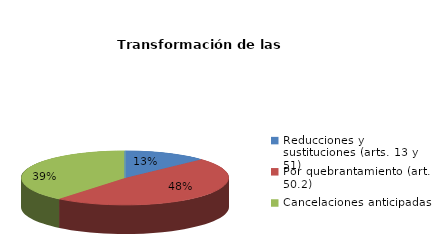
| Category | Series 0 |
|---|---|
| Reducciones y sustituciones (arts. 13 y 51) | 3 |
| Por quebrantamiento (art. 50.2) | 11 |
| Cancelaciones anticipadas | 9 |
| Traslado a Centros Penitenciarios | 0 |
| Conversión internamientos en cerrados (art. 51.2) | 0 |